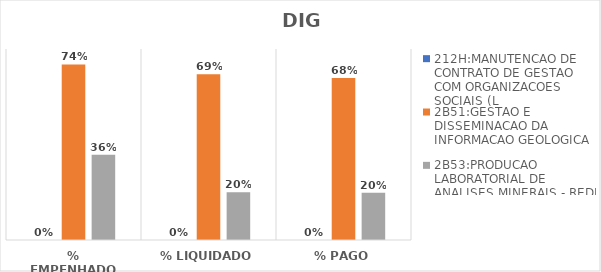
| Category | 212H:MANUTENCAO DE CONTRATO DE GESTAO COM ORGANIZACOES SOCIAIS (L | 2B51:GESTAO E DISSEMINACAO DA INFORMACAO GEOLOGICA | 2B53:PRODUCAO LABORATORIAL DE ANALISES MINERAIS - REDE LAMIN |
|---|---|---|---|
| % EMPENHADO | 0 | 0.735 | 0.357 |
| % LIQUIDADO | 0 | 0.694 | 0.2 |
| % PAGO | 0 | 0.678 | 0.197 |